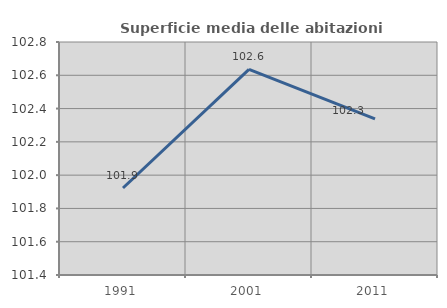
| Category | Superficie media delle abitazioni occupate |
|---|---|
| 1991.0 | 101.923 |
| 2001.0 | 102.635 |
| 2011.0 | 102.338 |